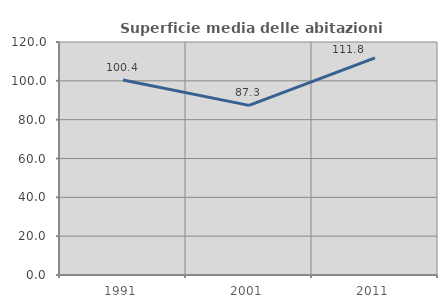
| Category | Superficie media delle abitazioni occupate |
|---|---|
| 1991.0 | 100.389 |
| 2001.0 | 87.346 |
| 2011.0 | 111.814 |